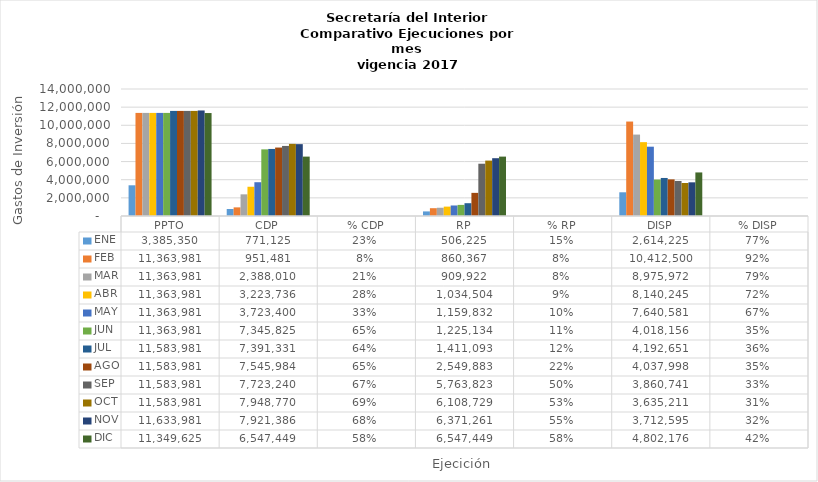
| Category | ENE | FEB | MAR | ABR | MAY  | JUN  | JUL | AGO | SEP | OCT | NOV | DIC |
|---|---|---|---|---|---|---|---|---|---|---|---|---|
| PPTO | 3385349.776 | 11363981.388 | 11363981.388 | 11363981.388 | 11363981.388 | 11363981.388 | 11583981.388 | 11583981.388 | 11583981.388 | 11583981.388 | 11633981.388 | 11349624.591 |
| CDP | 771124.604 | 951481.049 | 2388009.527 | 3223736.103 | 3723400.198 | 7345825.364 | 7391330.549 | 7545983.748 | 7723240.368 | 7948770.173 | 7921386.298 | 6547449.05 |
| % CDP | 0.228 | 0.084 | 0.21 | 0.284 | 0.328 | 0.646 | 0.638 | 0.651 | 0.667 | 0.686 | 0.681 | 0.577 |
| RP | 506224.604 | 860367.18 | 909921.705 | 1034503.813 | 1159831.909 | 1225134.005 | 1411093.089 | 2549883.324 | 5763823.288 | 6108729.055 | 6371260.893 | 6547449.05 |
| % RP | 0.15 | 0.076 | 0.08 | 0.091 | 0.102 | 0.108 | 0.122 | 0.22 | 0.498 | 0.527 | 0.548 | 0.577 |
| DISP | 2614225.172 | 10412500.339 | 8975971.861 | 8140245.285 | 7640581.19 | 4018156.024 | 4192650.839 | 4037997.64 | 3860741.02 | 3635211.215 | 3712595.09 | 4802175.541 |
| % DISP | 0.772 | 0.916 | 0.79 | 0.716 | 0.672 | 0.354 | 0.362 | 0.349 | 0.333 | 0.314 | 0.319 | 0.423 |